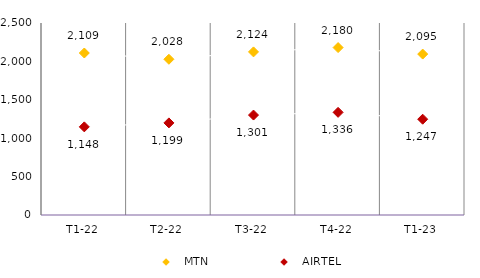
| Category | MTN | AIRTEL |
|---|---|---|
| T1-22 | 2109.341 | 1147.649 |
| T2-22 | 2027.698 | 1199.212 |
| T3-22 | 2123.675 | 1301.444 |
| T4-22 | 2180.143 | 1336.495 |
| T1-23 | 2095.467 | 1247.337 |